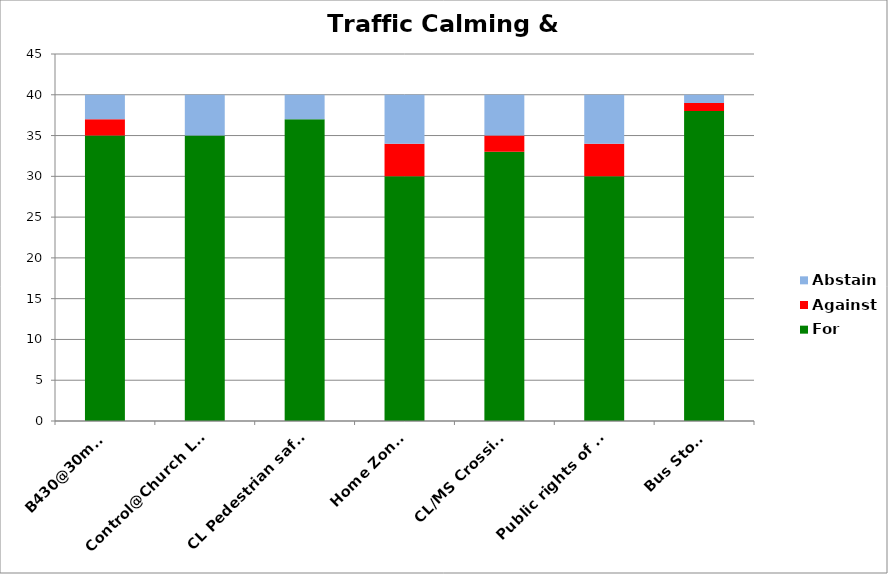
| Category | For | Against | Abstain |
|---|---|---|---|
| B430@30mph | 35 | 2 | 3 |
| Control@Church Lane | 35 | 0 | 5 |
| CL Pedestrian safety | 37 | 0 | 3 |
| Home Zones | 30 | 4 | 6 |
| CL/MS Crossing | 33 | 2 | 5 |
| Public rights of way | 30 | 4 | 6 |
| Bus Stops | 38 | 1 | 1 |